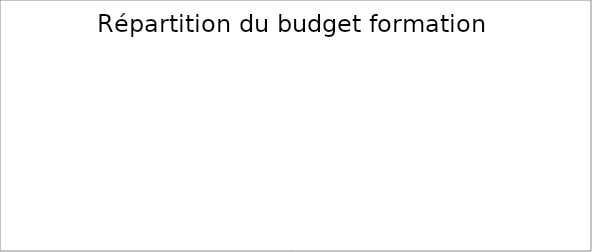
| Category | TOTAL |
|---|---|
| Montant des coûts pédagogiques | 0 |
| Montant des frais | 0 |
| Montant des salaires | 0 |